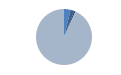
| Category | Series 0 |
|---|---|
| ARRASTRE | 100 |
| CERCO | 59 |
| PALANGRE | 20 |
| REDES DE ENMALLE | 5 |
| ARTES MENORES | 2450 |
| SIN TIPO ASIGNADO | 0 |